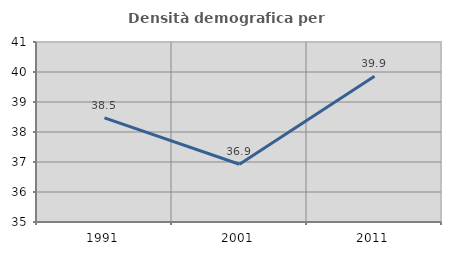
| Category | Densità demografica |
|---|---|
| 1991.0 | 38.473 |
| 2001.0 | 36.924 |
| 2011.0 | 39.856 |